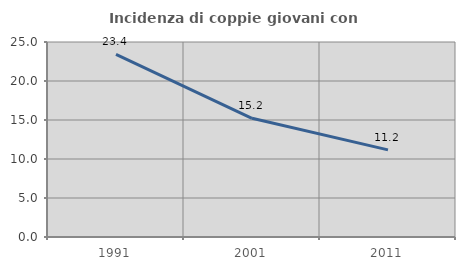
| Category | Incidenza di coppie giovani con figli |
|---|---|
| 1991.0 | 23.407 |
| 2001.0 | 15.22 |
| 2011.0 | 11.166 |